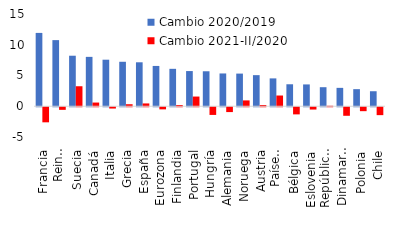
| Category | Cambio 2020/2019 |  Cambio 2021-II/2020  |
|---|---|---|
| Francia | 11.925 | -2.451 |
| Reino unido | 10.753 | -0.422 |
| Suecia | 8.215 | 3.253 |
| Canadá | 8.03 | 0.601 |
| Italia | 7.569 | -0.212 |
| Grecia | 7.232 | 0.329 |
| España | 7.148 | 0.457 |
| Eurozona | 6.554 | -0.343 |
| Finlandia | 6.086 | 0.2 |
| Portugal | 5.721 | 1.577 |
| Hungría | 5.688 | -1.249 |
| Alemania | 5.332 | -0.786 |
| Noruega | 5.31 | 0.951 |
| Austria | 5.058 | 0.204 |
| Países bajos | 4.53 | 1.745 |
| Bélgica | 3.575 | -1.159 |
| Eslovenia | 3.549 | -0.373 |
| República checa | 3.097 | 0.08 |
| Dinamarca | 2.99 | -1.388 |
| Polonia | 2.779 | -0.638 |
| Chile | 2.442 | -1.283 |